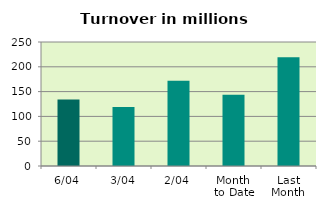
| Category | Series 0 |
|---|---|
| 6/04 | 134.272 |
| 3/04 | 118.761 |
| 2/04 | 171.812 |
| Month 
to Date | 143.625 |
| Last
Month | 219.362 |